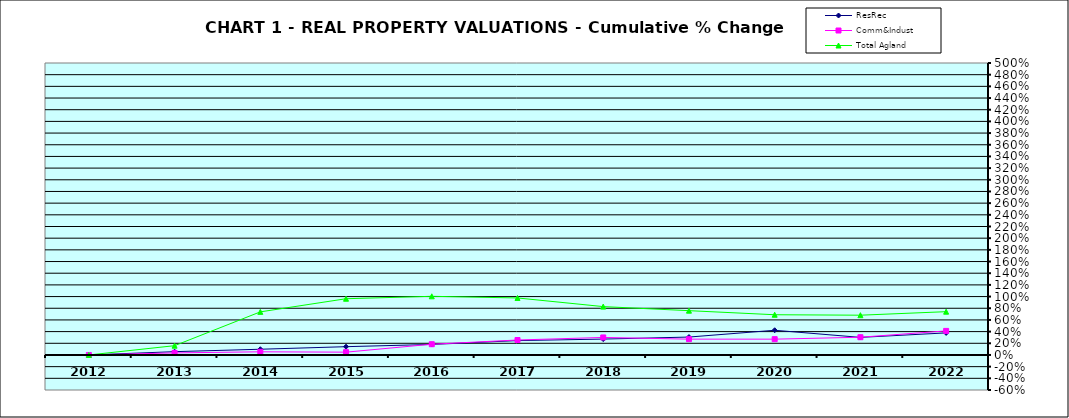
| Category | ResRec | Comm&Indust | Total Agland |
|---|---|---|---|
| 2012.0 | 0 | 0 | 0 |
| 2013.0 | 0.056 | 0.035 | 0.159 |
| 2014.0 | 0.098 | 0.054 | 0.738 |
| 2015.0 | 0.142 | 0.048 | 0.963 |
| 2016.0 | 0.18 | 0.184 | 1.004 |
| 2017.0 | 0.246 | 0.256 | 0.976 |
| 2018.0 | 0.272 | 0.3 | 0.828 |
| 2019.0 | 0.307 | 0.271 | 0.759 |
| 2020.0 | 0.423 | 0.271 | 0.689 |
| 2021.0 | 0.301 | 0.304 | 0.681 |
| 2022.0 | 0.378 | 0.412 | 0.741 |